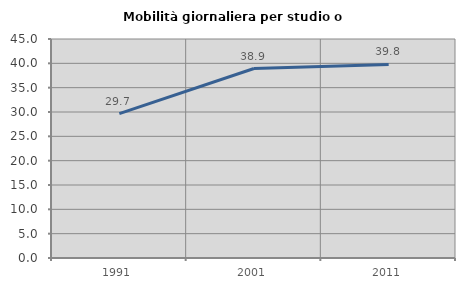
| Category | Mobilità giornaliera per studio o lavoro |
|---|---|
| 1991.0 | 29.655 |
| 2001.0 | 38.938 |
| 2011.0 | 39.773 |